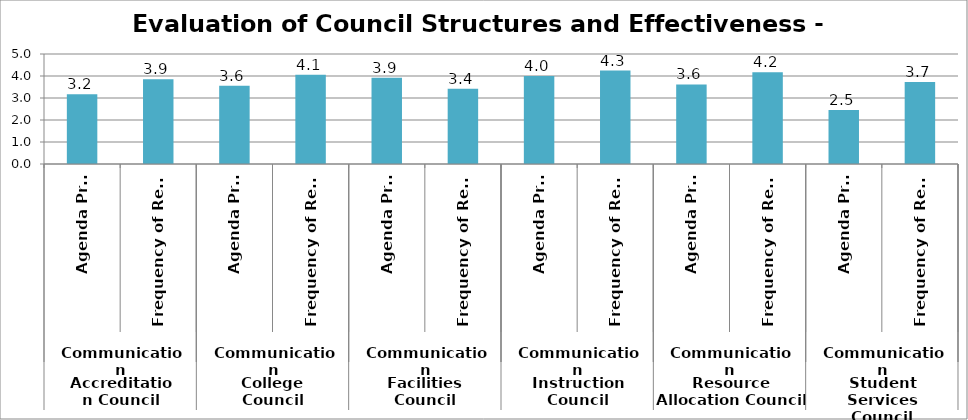
| Category | Total |
|---|---|
| 0 | 3.167 |
| 1 | 3.857 |
| 2 | 3.556 |
| 3 | 4.062 |
| 4 | 3.917 |
| 5 | 3.417 |
| 6 | 4 |
| 7 | 4.25 |
| 8 | 3.615 |
| 9 | 4.167 |
| 10 | 2.455 |
| 11 | 3.727 |